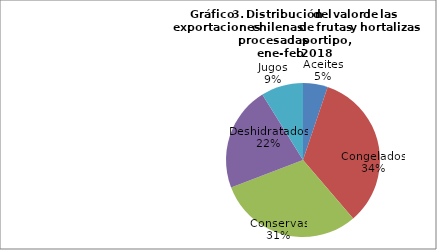
| Category | Series 0 |
|---|---|
| Aceites | 10781530.82 |
| Congelados | 69603033.98 |
| Conservas | 63294331.91 |
| Deshidratados | 45611546.92 |
| Jugos | 18376744.27 |